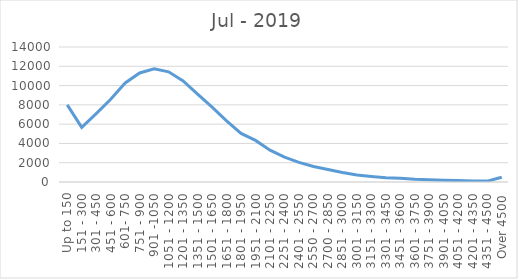
| Category | Jul - 2019 |
|---|---|
| Up to 150 | 8004 |
| 151 - 300 | 5666 |
| 301 - 450 | 7096 |
| 451 - 600 | 8578 |
| 601- 750 | 10272 |
| 751 - 900 | 11310 |
| 901 -1050 | 11731 |
| 1051 - 1200 | 11429 |
| 1201 - 1350 | 10487 |
| 1351 - 1500 | 9106 |
| 1501 - 1650 | 7762 |
| 1651 - 1800 | 6349 |
| 1801 - 1950 | 5037 |
| 1951 - 2100 | 4315 |
| 2101 - 2250 | 3297 |
| 2251 - 2400 | 2576 |
| 2401 - 2550 | 2041 |
| 2550 - 2700 | 1611 |
| 2700 - 2850 | 1301 |
| 2851 - 3000 | 979 |
| 3001 - 3150 | 717 |
| 3151 - 3300 | 575 |
| 3301 - 3450 | 453 |
| 3451 - 3600 | 377 |
| 3601 - 3750 | 278 |
| 3751 - 3900 | 233 |
| 3901 - 4050 | 178 |
| 4051 - 4200 | 153 |
| 4201 - 4350 | 99 |
| 4351 - 4500 | 91 |
| Over 4500 | 493 |